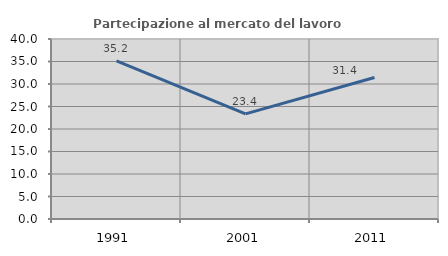
| Category | Partecipazione al mercato del lavoro  femminile |
|---|---|
| 1991.0 | 35.15 |
| 2001.0 | 23.352 |
| 2011.0 | 31.445 |